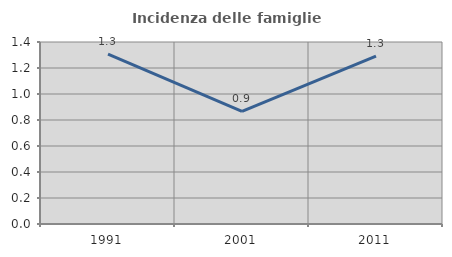
| Category | Incidenza delle famiglie numerose |
|---|---|
| 1991.0 | 1.307 |
| 2001.0 | 0.866 |
| 2011.0 | 1.292 |